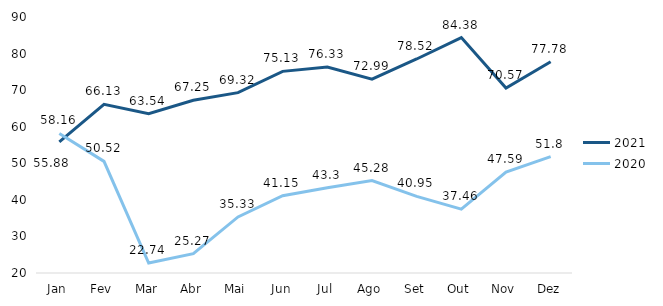
| Category | 2021 | 2020 |
|---|---|---|
| Jan | 55.88 | 58.16 |
| Fev | 66.13 | 50.52 |
| Mar | 63.54 | 22.74 |
| Abr | 67.25 | 25.27 |
| Mai | 69.32 | 35.33 |
| Jun | 75.13 | 41.15 |
| Jul | 76.33 | 43.3 |
| Ago | 72.99 | 45.28 |
| Set | 78.52 | 40.95 |
| Out | 84.38 | 37.46 |
| Nov | 70.57 | 47.59 |
| Dez | 77.78 | 51.8 |